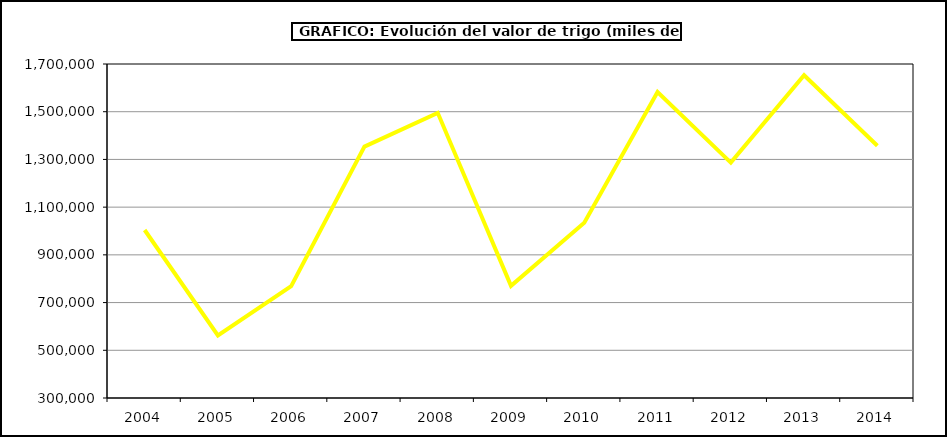
| Category | Valor |
|---|---|
| 2004.0 | 1004186.446 |
| 2005.0 | 562126.482 |
| 2006.0 | 769156.373 |
| 2007.0 | 1353566.298 |
| 2008.0 | 1495406.813 |
| 2009.0 | 770204.952 |
| 2010.0 | 1034362.398 |
| 2011.0 | 1582317.395 |
| 2012.0 | 1286558.361 |
| 2013.0 | 1652767.635 |
| 2014.0 | 1357332.32 |